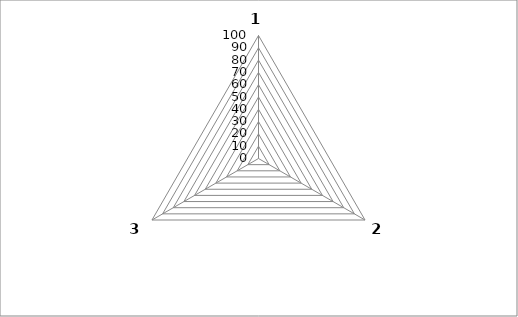
| Category | Series 0 |
|---|---|
| 1.0 | 0 |
| 2.0 | 0 |
| 3.0 | 0 |